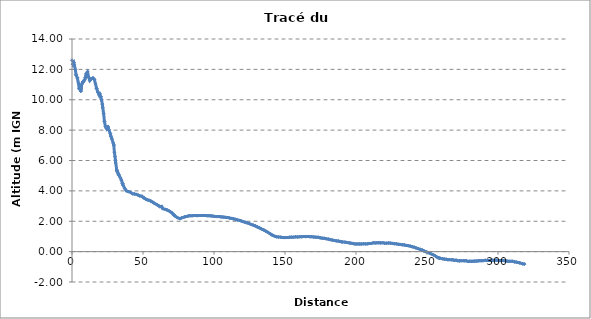
| Category | Series 0 |
|---|---|
| 0.0 | 12.598 |
| 0.58588224093232 | 12.343 |
| 0.6343264147727553 | 12.338 |
| 1.274586207577783 | 12.438 |
| 1.281503023459004 | 12.439 |
| 1.5574761640054398 | 12.305 |
| 2.3728095166528322 | 11.984 |
| 2.8586019312145625 | 11.64 |
| 2.9022654942994444 | 11.631 |
| 3.7836384605614914 | 11.425 |
| 3.9585363462053063 | 11.439 |
| 4.499739547814534 | 11.104 |
| 5.021982974779555 | 10.761 |
| 5.388065515275585 | 10.745 |
| 5.659568976271976 | 10.744 |
| 6.205978811177876 | 10.824 |
| 6.04008244958588 | 10.641 |
| 6.227291947398721 | 10.551 |
| 6.798572276363777 | 11.007 |
| 7.719110052824225 | 11.2 |
| 7.629814480284107 | 11.132 |
| 8.938103434578695 | 11.314 |
| 9.49981062941218 | 11.477 |
| 9.515081975715814 | 11.47 |
| 9.909204307561426 | 11.7 |
| 10.86777714143627 | 11.819 |
| 11.04801158555268 | 11.834 |
| 11.840690224855585 | 11.477 |
| 11.927856555441563 | 11.446 |
| 12.553564951583443 | 11.263 |
| 13.658619622802316 | 11.373 |
| 14.721380947438718 | 11.435 |
| 15.731381249451282 | 11.341 |
| 16.563297527920888 | 11.041 |
| 17.29173912586493 | 10.759 |
| 17.40872266977765 | 10.741 |
| 18.15348586380935 | 10.51 |
| 19.125953283409597 | 10.313 |
| 19.51393760873702 | 10.428 |
| 19.60405310137266 | 10.313 |
| 20.263470285246903 | 10.202 |
| 20.23195761697107 | 10.21 |
| 20.796566759869478 | 9.994 |
| 21.348230770009135 | 9.71 |
| 21.688971299089154 | 9.467 |
| 22.240026079607947 | 9.11 |
| 22.847794992066856 | 8.564 |
| 23.576284546024798 | 8.239 |
| 24.467079699374246 | 8.091 |
| 24.418316669972274 | 8.111 |
| 25.29571947943422 | 8.244 |
| 25.351132597630436 | 8.142 |
| 25.987199618524034 | 8.017 |
| 26.927337076086285 | 7.78 |
| 27.299763222132878 | 7.615 |
| 27.441902721654852 | 7.579 |
| 28.081721457336993 | 7.423 |
| 29.03714121580343 | 7.148 |
| 29.40868689724102 | 7.022 |
| 29.418317321238995 | 7.013 |
| 29.853732581179056 | 6.547 |
| 30.28970130303611 | 6.258 |
| 30.550458359919133 | 6.027 |
| 30.795530406649057 | 5.834 |
| 31.516619885903634 | 5.379 |
| 31.686478188484436 | 5.306 |
| 31.82061025519505 | 5.3 |
| 32.30078649187758 | 5.182 |
| 33.0090150716429 | 5.035 |
| 32.89784199651503 | 5.079 |
| 34.047096630983475 | 4.859 |
| 34.80246120635312 | 4.705 |
| 35.58404267383442 | 4.481 |
| 35.658326404800874 | 4.468 |
| 36.01238725775154 | 4.368 |
| 37.078350583370145 | 4.169 |
| 38.36691845873719 | 4.002 |
| 39.7579358748574 | 3.95 |
| 41.24239106763886 | 3.904 |
| 42.68125172748988 | 3.811 |
| 44.01056106199614 | 3.795 |
| 45.369660038386336 | 3.769 |
| 46.59041079459482 | 3.718 |
| 47.85394313938823 | 3.665 |
| 49.195444921065096 | 3.648 |
| 50.387795208926214 | 3.549 |
| 50.782361997451304 | 3.555 |
| 51.80917466997249 | 3.464 |
| 53.03935784919732 | 3.412 |
| 54.34811795239931 | 3.378 |
| 55.59477659837084 | 3.32 |
| 56.77560857420592 | 3.26 |
| 57.8682581388157 | 3.19 |
| 59.798722695782295 | 3.092 |
| 60.806162854220865 | 3.038 |
| 61.86085735733757 | 2.96 |
| 63.05341767911141 | 2.978 |
| 63.96618032251766 | 2.83 |
| 65.74506038469127 | 2.779 |
| 66.81476082437888 | 2.75 |
| 67.98930440888743 | 2.699 |
| 69.24538986074404 | 2.625 |
| 70.43620127451047 | 2.551 |
| 71.49772813157455 | 2.435 |
| 71.88397619080635 | 2.407 |
| 72.7319501322655 | 2.331 |
| 74.1821656736403 | 2.239 |
| 76.03436497425989 | 2.171 |
| 77.1173655802402 | 2.218 |
| 79.47983877686345 | 2.293 |
| 80.8452858861955 | 2.317 |
| 82.28832210001545 | 2.357 |
| 83.76875133383929 | 2.365 |
| 85.15642203067861 | 2.368 |
| 86.6305258903606 | 2.38 |
| 88.09103911892282 | 2.369 |
| 89.57410666565544 | 2.378 |
| 90.97757047793486 | 2.377 |
| 92.38482927413628 | 2.382 |
| 93.90944172472402 | 2.376 |
| 95.26136295513935 | 2.366 |
| 96.57670415296995 | 2.368 |
| 97.88256515328344 | 2.353 |
| 99.25580449022088 | 2.34 |
| 100.61680915782328 | 2.315 |
| 101.98995758877206 | 2.306 |
| 103.28567254469567 | 2.311 |
| 104.52609171880367 | 2.296 |
| 105.61962352705916 | 2.284 |
| 106.9003881799396 | 2.269 |
| 108.1819358770642 | 2.256 |
| 109.58130839210776 | 2.246 |
| 110.97091742415392 | 2.21 |
| 112.33185359909228 | 2.187 |
| 113.76323294510122 | 2.159 |
| 115.1934589503834 | 2.126 |
| 116.60650219452003 | 2.086 |
| 117.9924929518125 | 2.055 |
| 119.27179687606726 | 2.017 |
| 120.58520433733266 | 1.976 |
| 121.89071518366963 | 1.935 |
| 123.20277638557096 | 1.897 |
| 124.62879289334464 | 1.859 |
| 126.08319907146543 | 1.792 |
| 127.58186018772761 | 1.745 |
| 129.07000302146164 | 1.692 |
| 130.4883691373454 | 1.626 |
| 131.97125533224457 | 1.566 |
| 133.3770545556957 | 1.492 |
| 134.97272631550297 | 1.431 |
| 136.4939645000013 | 1.347 |
| 137.9393824617736 | 1.269 |
| 139.23390501573644 | 1.197 |
| 140.3730733618024 | 1.12 |
| 141.26268519688853 | 1.075 |
| 141.42002100485752 | 1.066 |
| 142.84774017863373 | 1.007 |
| 144.10767668684153 | 0.974 |
| 145.47355513975134 | 0.966 |
| 146.9780577123724 | 0.95 |
| 148.25349528779307 | 0.932 |
| 149.47238223150077 | 0.922 |
| 150.7995336895562 | 0.927 |
| 152.18356411954903 | 0.926 |
| 153.39435210300647 | 0.951 |
| 154.69066353579808 | 0.953 |
| 156.1073115075864 | 0.952 |
| 157.50347379320286 | 0.975 |
| 158.92194373374568 | 0.964 |
| 160.3770672505558 | 0.982 |
| 161.75860906015754 | 0.981 |
| 163.24584286581873 | 0.998 |
| 164.60179445233328 | 0.986 |
| 166.06185778196723 | 0.997 |
| 167.4401921883216 | 0.984 |
| 168.86376933245762 | 0.984 |
| 170.36486234279627 | 0.959 |
| 171.74758183200447 | 0.952 |
| 173.27385889965285 | 0.945 |
| 174.692470501636 | 0.911 |
| 176.0882510246551 | 0.888 |
| 177.54373239837764 | 0.877 |
| 179.02976450067052 | 0.847 |
| 180.52941983202678 | 0.823 |
| 182.031247938361 | 0.785 |
| 183.41997279787674 | 0.757 |
| 184.77827406099237 | 0.736 |
| 186.10067959277396 | 0.708 |
| 187.45724559204228 | 0.7 |
| 188.5782535980622 | 0.672 |
| 190.15760824412607 | 0.641 |
| 190.22213402513646 | 0.642 |
| 192.28327895345276 | 0.623 |
| 193.78958620113337 | 0.6 |
| 195.2071014513114 | 0.575 |
| 196.284000254834 | 0.556 |
| 197.570709734275 | 0.54 |
| 198.72727452505057 | 0.513 |
| 200.05309676445367 | 0.503 |
| 201.39851743283035 | 0.509 |
| 202.71464086260272 | 0.503 |
| 203.9504810607158 | 0.504 |
| 205.28908518940852 | 0.517 |
| 206.66255908656962 | 0.508 |
| 208.02209373576383 | 0.512 |
| 209.37537070334727 | 0.538 |
| 210.6571610363642 | 0.533 |
| 212.16631223862265 | 0.583 |
| 213.47242709535104 | 0.572 |
| 214.76002109540426 | 0.58 |
| 216.11957367440152 | 0.582 |
| 217.38764959444794 | 0.572 |
| 218.86915325152577 | 0.587 |
| 220.15595745995418 | 0.555 |
| 221.54104605679137 | 0.557 |
| 223.03317462888432 | 0.566 |
| 224.30597967069235 | 0.556 |
| 225.7280669698599 | 0.541 |
| 226.97011465145548 | 0.522 |
| 228.42420004204232 | 0.515 |
| 229.8155761583213 | 0.482 |
| 231.19370229557572 | 0.473 |
| 232.58865234834656 | 0.451 |
| 233.98987072564148 | 0.441 |
| 235.34376309116936 | 0.408 |
| 236.76462684519174 | 0.391 |
| 238.20077296718202 | 0.36 |
| 239.5785343728147 | 0.322 |
| 240.95423369778118 | 0.293 |
| 242.30749363749112 | 0.242 |
| 243.71957172114156 | 0.199 |
| 245.13970239231813 | 0.15 |
| 246.59243684440375 | 0.107 |
| 247.95238801008892 | 0.039 |
| 249.41315046769495 | -0.011 |
| 250.8739877192588 | -0.065 |
| 252.32551152033943 | -0.126 |
| 253.83274816709132 | -0.186 |
| 255.30732569630538 | -0.255 |
| 256.72584656203287 | -0.34 |
| 257.93388990443447 | -0.41 |
| 258.8543170396065 | -0.426 |
| 259.0907723948032 | -0.439 |
| 261.0512949232942 | -0.473 |
| 262.22080254073416 | -0.493 |
| 263.4579566797064 | -0.502 |
| 264.54767741394676 | -0.529 |
| 265.59206837951984 | -0.526 |
| 267.1976475384453 | -0.536 |
| 268.1953911983775 | -0.54 |
| 269.16621096459875 | -0.577 |
| 270.45497963468296 | -0.561 |
| 271.6395111046676 | -0.599 |
| 272.8508379389771 | -0.61 |
| 274.0194246860131 | -0.595 |
| 275.69696374993924 | -0.595 |
| 276.70132849723814 | -0.604 |
| 277.7945138645672 | -0.603 |
| 278.9426382786903 | -0.646 |
| 280.13139214467384 | -0.633 |
| 281.25925112119404 | -0.639 |
| 282.4469228161063 | -0.632 |
| 283.6187036657874 | -0.623 |
| 284.73265215672535 | -0.626 |
| 285.9119714879033 | -0.608 |
| 287.09819605323 | -0.596 |
| 288.36250554655504 | -0.595 |
| 289.6288238277665 | -0.593 |
| 290.8736418052979 | -0.573 |
| 292.20374131753 | -0.579 |
| 293.4451076590768 | -0.58 |
| 294.73397062484327 | -0.576 |
| 296.0414623733074 | -0.562 |
| 297.2952804285453 | -0.576 |
| 298.68917326390937 | -0.564 |
| 300.01220153987725 | -0.577 |
| 301.2568493583518 | -0.59 |
| 302.58187010006725 | -0.581 |
| 303.8627726867029 | -0.588 |
| 305.2188605085995 | -0.601 |
| 306.4513983018477 | -0.626 |
| 307.72880380668386 | -0.639 |
| 308.987407188236 | -0.641 |
| 310.3072861168387 | -0.638 |
| 311.79189543026797 | -0.676 |
| 312.9900171729366 | -0.693 |
| 314.27336786022 | -0.716 |
| 315.3747470190281 | -0.743 |
| 317.37490041273685 | -0.803 |
| 318.6645413377562 | -0.819 |